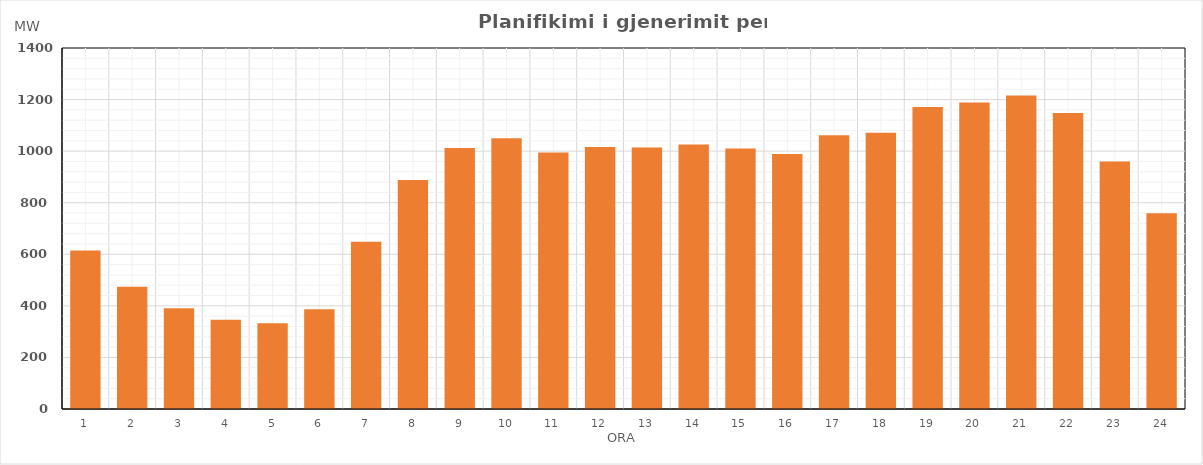
| Category | Max (MW) |
|---|---|
| 0 | 614.734 |
| 1 | 474.4 |
| 2 | 390.4 |
| 3 | 345.777 |
| 4 | 332.673 |
| 5 | 386.4 |
| 6 | 648.4 |
| 7 | 888.4 |
| 8 | 1012.527 |
| 9 | 1049.877 |
| 10 | 995.091 |
| 11 | 1016.281 |
| 12 | 1014.209 |
| 13 | 1025.289 |
| 14 | 1010.189 |
| 15 | 989.011 |
| 16 | 1061.898 |
| 17 | 1071.4 |
| 18 | 1171.215 |
| 19 | 1188.307 |
| 20 | 1215.568 |
| 21 | 1148.118 |
| 22 | 960.229 |
| 23 | 759.4 |